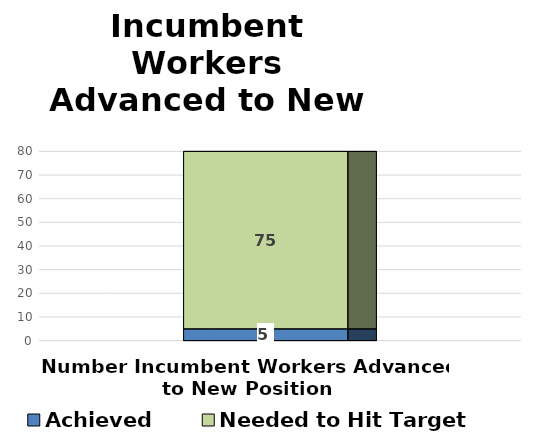
| Category | Achieved | Needed to Hit Target |
|---|---|---|
| Number Incumbent Workers Advanced to New Position | 5 | 75 |